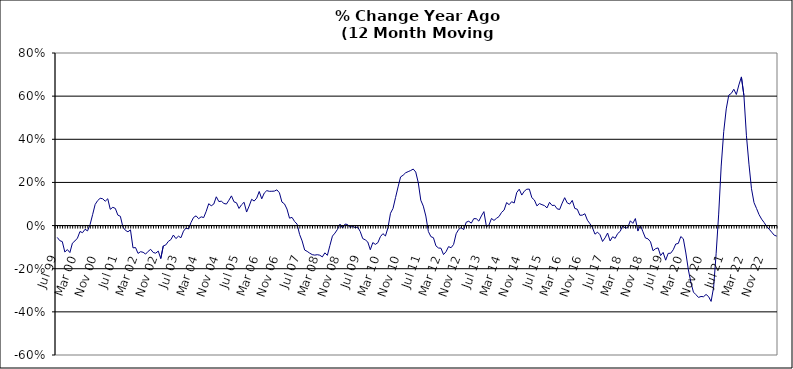
| Category | Series 0 |
|---|---|
| Jul 99 | -0.055 |
| Aug 99 | -0.07 |
| Sep 99 | -0.074 |
| Oct 99 | -0.123 |
| Nov 99 | -0.111 |
| Dec 99 | -0.125 |
| Jan 00 | -0.082 |
| Feb 00 | -0.071 |
| Mar 00 | -0.058 |
| Apr 00 | -0.027 |
| May 00 | -0.033 |
| Jun 00 | -0.017 |
| Jul 00 | -0.025 |
| Aug 00 | 0.005 |
| Sep 00 | 0.05 |
| Oct 00 | 0.098 |
| Nov 00 | 0.116 |
| Dec 00 | 0.127 |
| Jan 01 | 0.124 |
| Feb 01 | 0.113 |
| Mar 01 | 0.124 |
| Apr 01 | 0.075 |
| May 01 | 0.085 |
| Jun 01 | 0.08 |
| Jul 01 | 0.048 |
| Aug 01 | 0.043 |
| Sep 01 | -0.007 |
| Oct 01 | -0.022 |
| Nov 01 | -0.029 |
| Dec 01 | -0.02 |
| Jan 02 | -0.103 |
| Feb 02 | -0.102 |
| Mar 02 | -0.129 |
| Apr 02 | -0.121 |
| May 02 | -0.124 |
| Jun 02 | -0.132 |
| Jul 02 | -0.119 |
| Aug 02 | -0.11 |
| Sep 02 | -0.125 |
| Oct 02 | -0.128 |
| Nov 02 | -0.118 |
| Dec 02 | -0.153 |
| Jan 03 | -0.094 |
| Feb 03 | -0.09 |
| Mar 03 | -0.073 |
| Apr 03 | -0.065 |
| May 03 | -0.044 |
| Jun 03 | -0.06 |
| Jul 03 | -0.049 |
| Aug 03 | -0.056 |
| Sep 03 | -0.026 |
| Oct 03 | -0.012 |
| Nov 03 | -0.016 |
| Dec 03 | 0.014 |
| Jan 04 | 0.038 |
| Feb 04 | 0.045 |
| Mar 04 | 0.032 |
| Apr 04 | 0.041 |
| May 04 | 0.037 |
| Jun 04 | 0.066 |
| Jul 04 | 0.101 |
| Aug 04 | 0.092 |
| Sep 04 | 0.1 |
| Oct 04 | 0.133 |
| Nov 04 | 0.111 |
| Dec 04 | 0.113 |
| Jan 05 | 0.103 |
| Feb 05 | 0.1 |
| Mar 05 | 0.118 |
| Apr 05 | 0.138 |
| May 05 | 0.11 |
| Jun 05 | 0.106 |
| Jul 05 | 0.079 |
| Aug 05 | 0.097 |
| Sep 05 | 0.108 |
| Oct 05 | 0.063 |
| Nov 05 | 0.09 |
| Dec 05 | 0.122 |
| Jan 06 | 0.114 |
| Feb 06 | 0.127 |
| Mar 06 | 0.158 |
| Apr 06 | 0.124 |
| May 06 | 0.151 |
| Jun 06 | 0.162 |
| Jul 06 | 0.159 |
| Aug 06 | 0.159 |
| Sep 06 | 0.16 |
| Oct 06 | 0.166 |
| Nov 06 | 0.152 |
| Dec 06 | 0.109 |
| Jan 07 | 0.101 |
| Feb 07 | 0.076 |
| Mar 07 | 0.034 |
| Apr 07 | 0.038 |
| May 07 | 0.019 |
| Jun 07 | 0.007 |
| Jul 07 | -0.041 |
| Aug 07 | -0.071 |
| Sep 07 | -0.113 |
| Oct 07 | -0.12 |
| Nov 07 | -0.128 |
| Dec 07 | -0.135 |
| Jan 08 | -0.137 |
| Feb 08 | -0.135 |
| Mar 08 | -0.137 |
| Apr 08 | -0.145 |
| May 08 | -0.126 |
| Jun 08 | -0.138 |
| Jul 08 | -0.093 |
| Aug 08 | -0.049 |
| Sep-08 | -0.035 |
| Oct 08 | -0.018 |
| Nov 08 | 0.007 |
| Dec 08 | -0.011 |
| Jan 09 | 0.007 |
| Feb 09 | 0.005 |
| Mar 09 | -0.009 |
| Apr 09 | -0.003 |
| May 09 | -0.01 |
| Jun 09 | -0.007 |
| Jul 09 | -0.027 |
| Aug 09 | -0.06 |
| Sep 09 | -0.066 |
| Oct 09 | -0.076 |
| Nov 09 | -0.112 |
| Dec 09 | -0.079 |
| Jan 10 | -0.087 |
| Feb 10 | -0.079 |
| Mar 10 | -0.052 |
| Apr 10 | -0.037 |
| May 10 | -0.048 |
| Jun 10 | -0.01 |
| Jul 10 | 0.057 |
| Aug 10 | 0.08 |
| Sep 10 | 0.13 |
| Oct 10 | 0.179 |
| Nov 10 | 0.226 |
| Dec 10 | 0.233 |
| Jan 11 | 0.245 |
| Feb 11 | 0.25 |
| Mar 11 | 0.255 |
| Apr 11 | 0.262 |
| May 11 | 0.248 |
| Jun 11 | 0.199 |
| Jul 11 | 0.118 |
| Aug 11 | 0.09 |
| Sep 11 | 0.044 |
| Oct 11 | -0.028 |
| Nov 11 | -0.051 |
| Dec 11 | -0.056 |
| Jan 12 | -0.094 |
| Feb 12 | -0.104 |
| Mar 12 | -0.105 |
| Apr 12 | -0.134 |
| May 12 | -0.121 |
| Jun 12 | -0.098 |
| Jul 12 | -0.103 |
| Aug 12 | -0.087 |
| Sep 12 | -0.038 |
| Oct 12 | -0.018 |
| Nov 12 | -0.009 |
| Dec 12 | -0.019 |
| Jan 13 | 0.016 |
| Feb-13 | 0.02 |
| Mar-13 | 0.011 |
| Apr 13 | 0.032 |
| May 13 | 0.032 |
| Jun-13 | 0.021 |
| Jul 13 | 0.045 |
| Aug 13 | 0.065 |
| Sep 13 | -0.005 |
| Oct 13 | 0.002 |
| Nov 13 | 0.033 |
| Dec 13 | 0.024 |
| Jan 14 | 0.034 |
| Feb-14 | 0.042 |
| Mar 14 | 0.061 |
| Apr 14 | 0.072 |
| May 14 | 0.107 |
| Jun 14 | 0.097 |
| Jul-14 | 0.111 |
| Aug-14 | 0.105 |
| Sep 14 | 0.153 |
| Oct 14 | 0.169 |
| Nov 14 | 0.141 |
| Dec 14 | 0.159 |
| Jan 15 | 0.169 |
| Feb 15 | 0.169 |
| Mar 15 | 0.129 |
| Apr-15 | 0.118 |
| May 15 | 0.091 |
| Jun-15 | 0.102 |
| Jul 15 | 0.097 |
| Aug 15 | 0.092 |
| Sep 15 | 0.082 |
| Oct 15 | 0.108 |
| Nov 15 | 0.093 |
| Dec 15 | 0.094 |
| Jan 16 | 0.078 |
| Feb 16 | 0.075 |
| Mar 16 | 0.104 |
| Apr 16 | 0.129 |
| May 16 | 0.105 |
| Jun 16 | 0.1 |
| Jul 16 | 0.117 |
| Aug 16 | 0.08 |
| Sep 16 | 0.076 |
| Oct 16 | 0.048 |
| Nov 16 | 0.048 |
| Dec 16 | 0.055 |
| Jan 17 | 0.025 |
| Feb 17 | 0.009 |
| Mar 17 | -0.01 |
| Apr 17 | -0.04 |
| May 17 | -0.031 |
| Jun 17 | -0.042 |
| Jul 17 | -0.074 |
| Aug 17 | -0.057 |
| Sep 17 | -0.035 |
| Oct 17 | -0.071 |
| Nov 17 | -0.052 |
| Dec 17 | -0.059 |
| Jan 18 | -0.037 |
| Feb 18 | -0.027 |
| Mar 18 | 0 |
| Apr 18 | -0.012 |
| May 18 | -0.009 |
| Jun 18 | 0.022 |
| Jul 18 | 0.01 |
| Aug 18 | 0.033 |
| Sep 18 | -0.025 |
| Oct 18 | 0.002 |
| Nov 18 | -0.029 |
| Dec 18 | -0.058 |
| Jan 19 | -0.061 |
| Feb 19 | -0.075 |
| Mar 19 | -0.117 |
| Apr 19 | -0.107 |
| May 19 | -0.104 |
| Jun 19 | -0.139 |
| Jul 19 | -0.124 |
| Aug 19 | -0.16 |
| Sep 19 | -0.129 |
| Oct 19 | -0.128 |
| Nov 19 | -0.112 |
| Dec 19 | -0.085 |
| Jan 20 | -0.083 |
| Feb 20 | -0.051 |
| Mar 20 | -0.061 |
| Apr 20 | -0.127 |
| May 20 | -0.206 |
| Jun 20 | -0.264 |
| Jul 20 | -0.308 |
| Aug 20 | -0.32 |
| Sep 20 | -0.333 |
| Oct 20 | -0.329 |
| Nov 20 | -0.33 |
| Dec 20 | -0.319 |
| Jan 21 | -0.329 |
| Feb 21 | -0.352 |
| Mar 21 | -0.286 |
| Apr 21 | -0.129 |
| May 21 | 0.053 |
| Jun 21 | 0.276 |
| Jul 21 | 0.435 |
| Aug 21 | 0.541 |
| Sep 21 | 0.604 |
| Oct 21 | 0.613 |
| Nov 21 | 0.632 |
| Dec 21 | 0.608 |
| Jan 22 | 0.652 |
| Feb 22 | 0.689 |
| Mar 22 | 0.603 |
| Apr 22 | 0.416 |
| May 22 | 0.285 |
| Jun 22 | 0.171 |
| Jul 22 | 0.106 |
| Aug 22 | 0.079 |
| Sep 22 | 0.051 |
| Oct 22 | 0.03 |
| Nov 22 | 0.014 |
| Dec 22 | -0.004 |
| Jan 23 | -0.017 |
| Feb 23 | -0.031 |
| Mar 23 | -0.045 |
| Apr 23 | -0.049 |